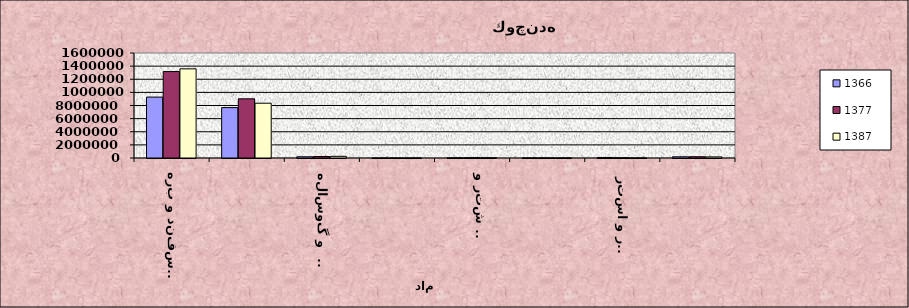
| Category | 1366 | 1377 | 1387 |
|---|---|---|---|
| گوسفند و بره | 9282846 | 13170943 | 13585689.112 |
| بز و بزغاله | 7678755 | 9016468 | 8348529.139 |
| گاو  و گوساله | 185800 | 229397 | 253877.427 |
| گاوميش و 
بچه گاوميش | 6508 | 9223 | 9270.5 |
| شتر و 
بچه شتر | 29690 | 45355 | 41641.833 |
| اسب و 
كره اسب | 20608 | 17529 | 17096.633 |
| قاطر و استر | 66016 | 32041 | 16028.5 |
| الاغ و كره الاغ | 185705 | 193912 | 168417.596 |